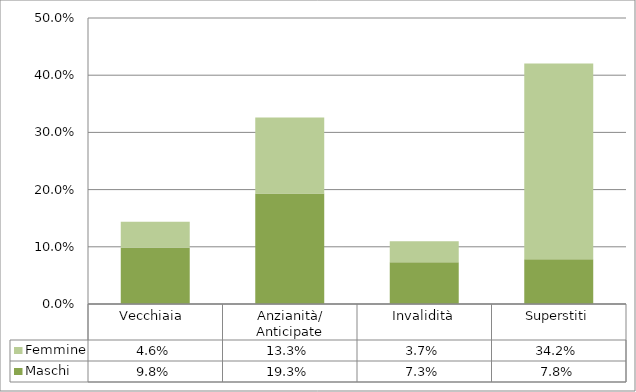
| Category | Maschi | Femmine |
|---|---|---|
| Vecchiaia  | 0.098 | 0.046 |
| Anzianità/ Anticipate | 0.193 | 0.133 |
| Invalidità | 0.073 | 0.037 |
| Superstiti | 0.078 | 0.342 |